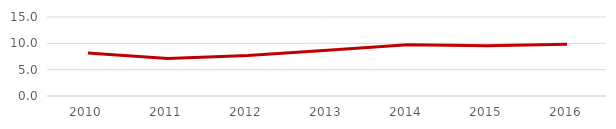
| Category | Proporción de la Recaudación de Ingresos del Total de Ingresos en cada Entidades Federativa |
|---|---|
| 2010.0 | 8.179 |
| 2011.0 | 7.11 |
| 2012.0 | 7.697 |
| 2013.0 | 8.697 |
| 2014.0 | 9.738 |
| 2015.0 | 9.544 |
| 2016.0 | 9.847 |